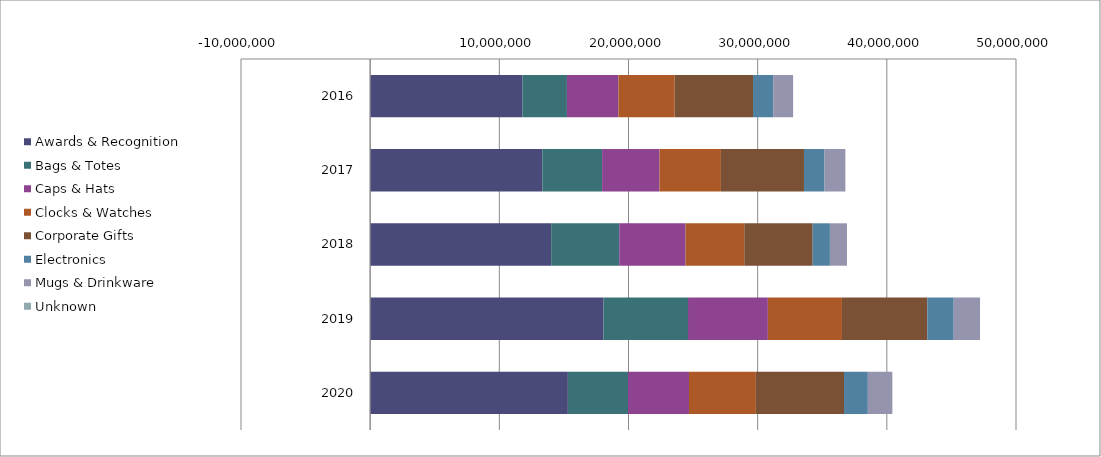
| Category | Awards & Recognition | Bags & Totes | Caps & Hats | Clocks & Watches | Corporate Gifts | Electronics | Mugs & Drinkware | Unknown |
|---|---|---|---|---|---|---|---|---|
| 2016 | 11790025.23 | 3443859.15 | 3985478.93 | 4356974.93 | 6063472.84 | 1563965.02 | 1540373.88 | -0.01 |
| 2017 | 13327355.2 | 4628815.78 | 4447290.06 | 4750922.03 | 6431752.67 | 1591383.43 | 1612983.79 | -0.003 |
| 2018 | 14014818.25 | 5270181.18 | 5135728.73 | 4540027.43 | 5295712.54 | 1338521.78 | 1323369.59 | 0.002 |
| 2019 | 18057944.64 | 6549720.6 | 6182353.94 | 5735714.63 | 6605518.58 | 2047134.85 | 2037755.49 | 0.007 |
| 2020 | 15305963.07 | 4656136.91 | 4721408.91 | 5176977.49 | 6824155.16 | 1846289.65 | 1897182.46 | -0.005 |